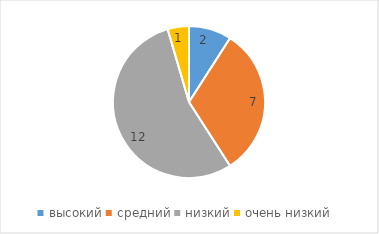
| Category | Series 0 |
|---|---|
| высокий | 2 |
| средний | 7 |
| низкий | 12 |
| очень низкий | 1 |